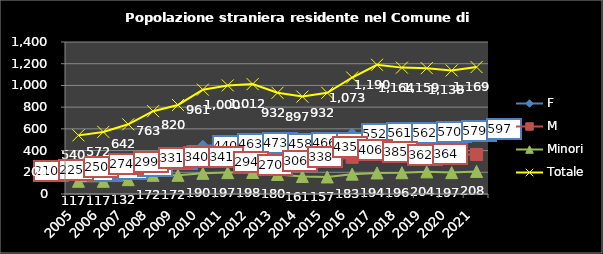
| Category | F | M | Minori | Totale |
|---|---|---|---|---|
| 2005.0 | 213 | 210 | 117 | 540 |
| 2006.0 | 230 | 225 | 117 | 572 |
| 2007.0 | 260 | 250 | 132 | 642 |
| 2008.0 | 318 | 274 | 172 | 763 |
| 2009.0 | 349 | 299 | 172 | 820 |
| 2010.0 | 440 | 331 | 190 | 961 |
| 2011.0 | 463 | 340 | 197 | 1000 |
| 2012.0 | 473 | 341 | 198 | 1012 |
| 2013.0 | 458 | 294 | 180 | 932 |
| 2014.0 | 466 | 270 | 161 | 897 |
| 2015.0 | 469 | 306 | 157 | 932 |
| 2016.0 | 552 | 338 | 183 | 1073 |
| 2017.0 | 561 | 435 | 194 | 1190 |
| 2018.0 | 562 | 406 | 196 | 1164 |
| 2019.0 | 570 | 385 | 204 | 1159 |
| 2020.0 | 579 | 362 | 197 | 1138 |
| 2021.0 | 597 | 364 | 208 | 1169 |